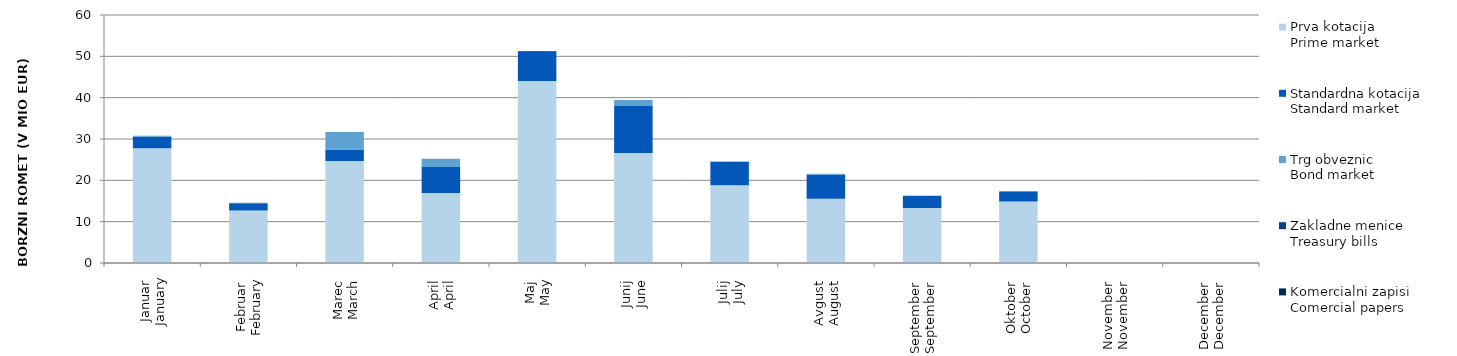
| Category | Prva kotacija
Prime market | Standardna kotacija
Standard market | Trg obveznic
Bond market | Zakladne menice
Treasury bills | Komercialni zapisi
Comercial papers |
|---|---|---|---|---|---|
| Januar
January | 27.745 | 2.796 | 0.249 | 0 | 0 |
| Februar
February | 12.685 | 1.784 | 0.118 | 0 | 0 |
| Marec
March | 24.676 | 2.813 | 4.174 | 0 | 0 |
| April
April | 16.942 | 6.272 | 2.01 | 0 | 0 |
| Maj
May | 44.02 | 7.1 | 0 | 0.145 | 0 |
| Junij
June | 26.612 | 11.39 | 1.425 | 0 | 0 |
| Julij
July | 18.826 | 5.646 | 0.075 | 0 | 0 |
| Avgust
August | 15.523 | 5.813 | 0.265 | 0 | 0 |
| September
September | 13.292 | 2.966 | 0.029 | 0 | 0 |
| Oktober
October | 14.908 | 2.252 | 0.23 | 0 | 0 |
| November
November | 0 | 0 | 0 | 0 | 0 |
| December
December | 0 | 0 | 0 | 0 | 0 |